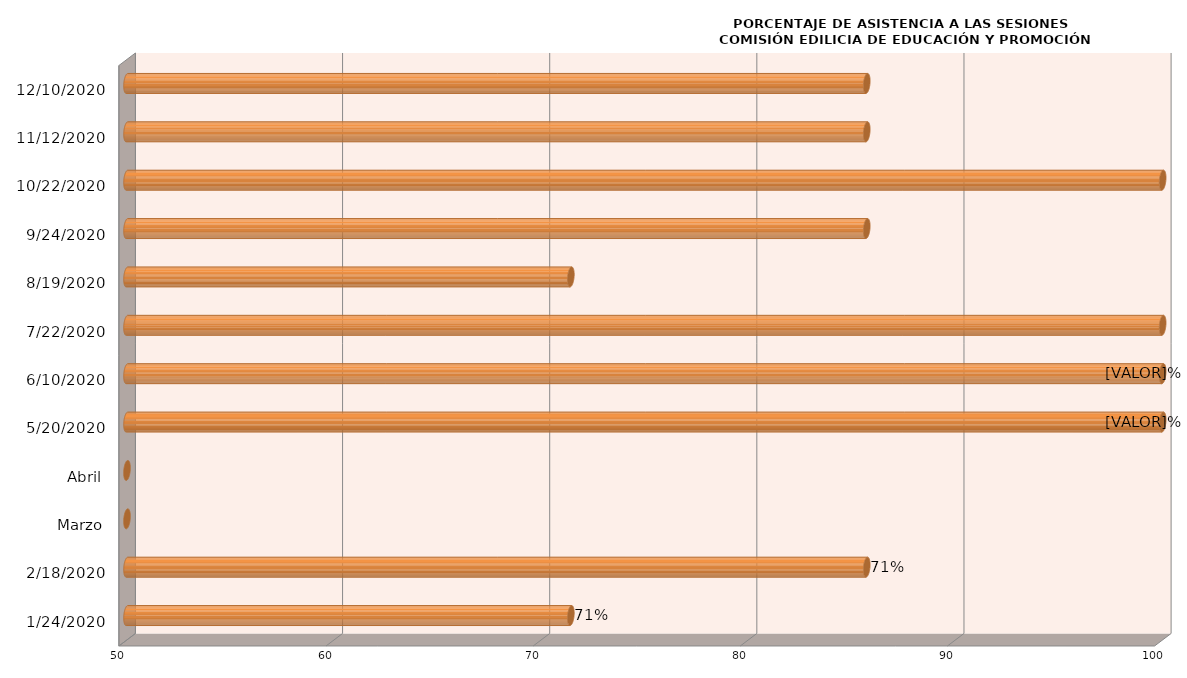
| Category | Series 0 |
|---|---|
| 24/01/2020 | 71.429 |
| 18/02/2020 | 85.714 |
| Marzo | 0 |
| Abril | 0 |
| 20/05/2020 | 100 |
| 10/06/2020 | 100 |
| 22/07/2020 | 100 |
| 19/08/2020 | 71.429 |
| 24/09/2020 | 85.714 |
| 22/10/2020 | 100 |
| 12/11/2020 | 85.714 |
| 10/12/2020 | 85.714 |